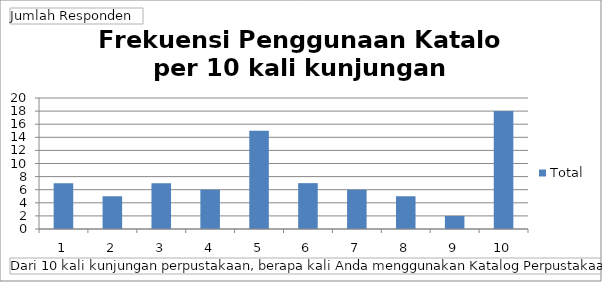
| Category | Total |
|---|---|
| 1 | 7 |
| 2 | 5 |
| 3 | 7 |
| 4 | 6 |
| 5 | 15 |
| 6 | 7 |
| 7 | 6 |
| 8 | 5 |
| 9 | 2 |
| 10 | 18 |